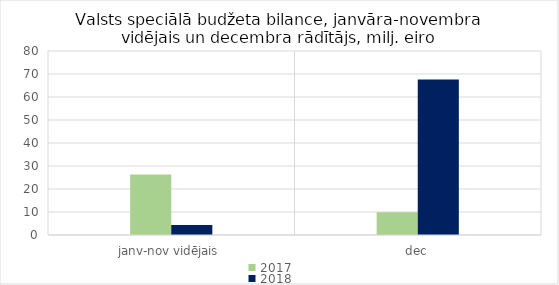
| Category | 2017 | 2018 |
|---|---|---|
| janv-nov vidējais | 26331.523 | 4299.916 |
| dec | 9903.929 | 67612.173 |